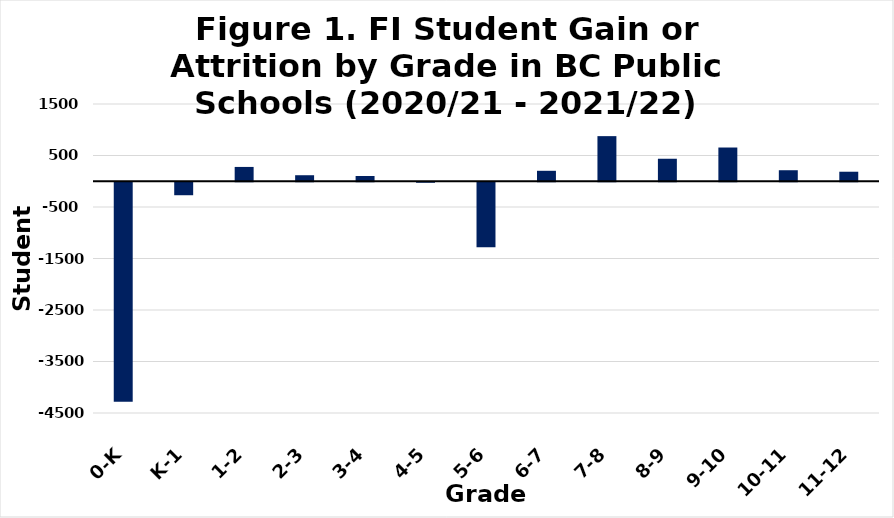
| Category | Student Gains/Attrition |
|---|---|
| 0-K | -4264 |
| K-1 | -252 |
| 1-2 | 278 |
| 2-3 | 117 |
| 3-4 | 102 |
| 4-5 | -10 |
| 5-6 | -1262 |
| 6-7 | 203 |
| 7-8 | 876 |
| 8-9 | 437 |
| 9-10 | 655 |
| 10-11 | 214 |
| 11-12 | 185 |